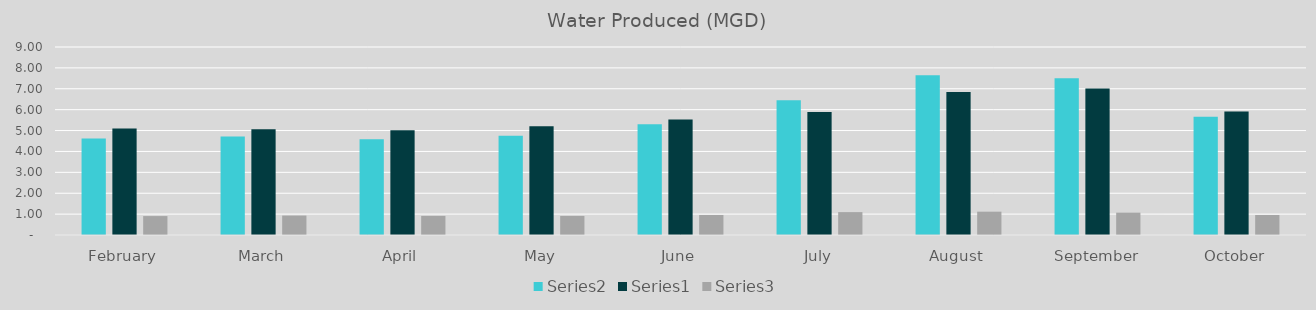
| Category | Series 1 | Series 0 | Series 2 |
|---|---|---|---|
| February | 4.62 | 5.1 | 0.906 |
| March | 4.71 | 5.06 | 0.931 |
| April | 4.58 | 5.01 | 0.914 |
| May | 4.75 | 5.21 | 0.912 |
| June | 5.3 | 5.53 | 0.958 |
| July | 6.45 | 5.89 | 1.095 |
| August | 7.65 | 6.85 | 1.117 |
| September | 7.5 | 7.01 | 1.07 |
| October | 5.66 | 5.91 | 0.958 |